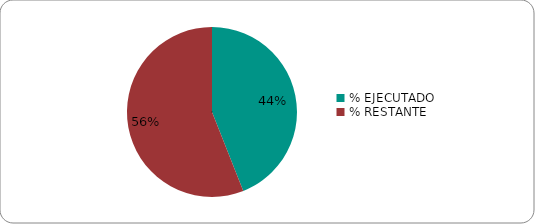
| Category | Series 0 |
|---|---|
| % EJECUTADO | 0.44 |
| % RESTANTE | 0.56 |